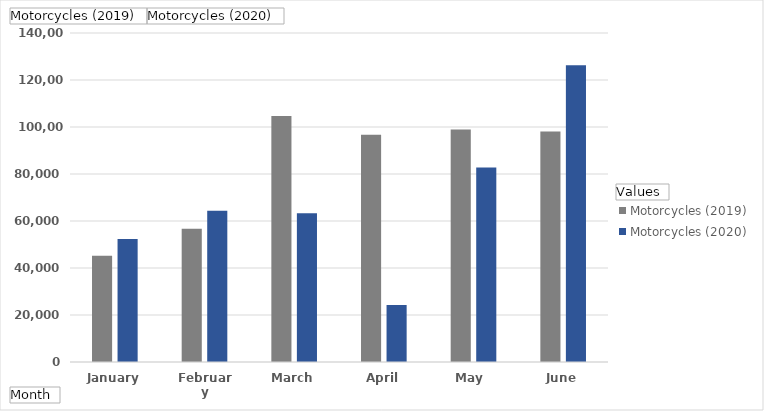
| Category | Motorcycles (2019) | Motorcycles (2020) |
|---|---|---|
| January | 45195 | 52289 |
| February | 56681 | 64395 |
| March | 104719 | 63264 |
| April | 96736 | 24245 |
| May  | 98989 | 82727 |
| June | 98050 | 126292 |